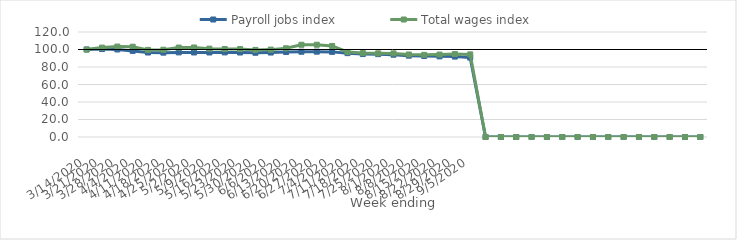
| Category | Payroll jobs index | Total wages index |
|---|---|---|
| 14/03/2020 | 100 | 100 |
| 21/03/2020 | 100.502 | 102.16 |
| 28/03/2020 | 100.07 | 103.357 |
| 04/04/2020 | 98.415 | 103.18 |
| 11/04/2020 | 96.541 | 99.549 |
| 18/04/2020 | 96.404 | 99.728 |
| 25/04/2020 | 96.709 | 102.205 |
| 02/05/2020 | 96.597 | 102.318 |
| 09/05/2020 | 96.598 | 100.964 |
| 16/05/2020 | 96.695 | 100.528 |
| 23/05/2020 | 96.57 | 100.461 |
| 30/05/2020 | 96.277 | 99.505 |
| 06/06/2020 | 96.522 | 99.858 |
| 13/06/2020 | 97.103 | 101.387 |
| 20/06/2020 | 97.456 | 105.413 |
| 27/06/2020 | 97.526 | 105.439 |
| 04/07/2020 | 97.284 | 104.07 |
| 11/07/2020 | 95.823 | 97.161 |
| 18/07/2020 | 94.786 | 95.868 |
| 25/07/2020 | 94.662 | 95.641 |
| 01/08/2020 | 94.065 | 95.558 |
| 08/08/2020 | 92.954 | 94.303 |
| 15/08/2020 | 92.591 | 93.864 |
| 22/08/2020 | 92.147 | 94.216 |
| 29/08/2020 | 91.904 | 94.819 |
| 05/09/2020 | 90.748 | 94.413 |